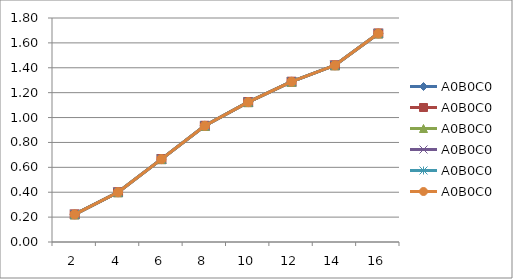
| Category | A0B0C0 |
|---|---|
| 2.0 | 0.222 |
| 4.0 | 0.4 |
| 6.0 | 0.666 |
| 8.0 | 0.934 |
| 10.0 | 1.124 |
| 12.0 | 1.288 |
| 14.0 | 1.42 |
| 16.0 | 1.676 |